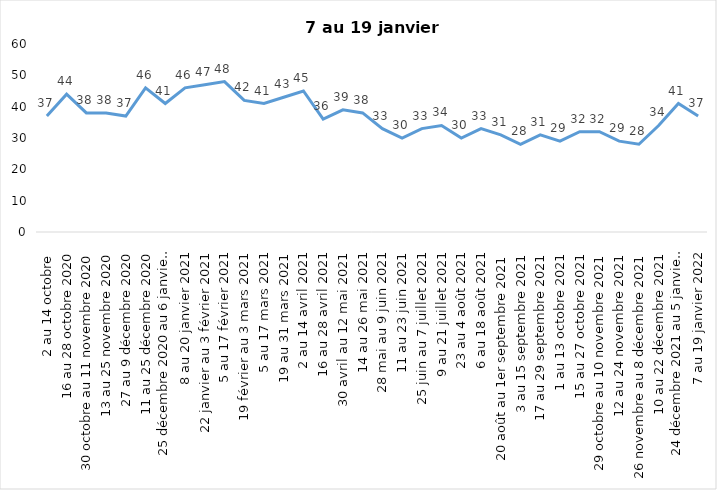
| Category | Toujours aux trois mesures |
|---|---|
| 2 au 14 octobre  | 37 |
| 16 au 28 octobre 2020 | 44 |
| 30 octobre au 11 novembre 2020 | 38 |
| 13 au 25 novembre 2020 | 38 |
| 27 au 9 décembre 2020 | 37 |
| 11 au 25 décembre 2020 | 46 |
| 25 décembre 2020 au 6 janvier 2021 | 41 |
| 8 au 20 janvier 2021 | 46 |
| 22 janvier au 3 février 2021 | 47 |
| 5 au 17 février 2021 | 48 |
| 19 février au 3 mars 2021 | 42 |
| 5 au 17 mars 2021 | 41 |
| 19 au 31 mars 2021 | 43 |
| 2 au 14 avril 2021 | 45 |
| 16 au 28 avril 2021 | 36 |
| 30 avril au 12 mai 2021 | 39 |
| 14 au 26 mai 2021 | 38 |
| 28 mai au 9 juin 2021 | 33 |
| 11 au 23 juin 2021 | 30 |
| 25 juin au 7 juillet 2021 | 33 |
| 9 au 21 juillet 2021 | 34 |
| 23 au 4 août 2021 | 30 |
| 6 au 18 août 2021 | 33 |
| 20 août au 1er septembre 2021 | 31 |
| 3 au 15 septembre 2021 | 28 |
| 17 au 29 septembre 2021 | 31 |
| 1 au 13 octobre 2021 | 29 |
| 15 au 27 octobre 2021 | 32 |
| 29 octobre au 10 novembre 2021 | 32 |
| 12 au 24 novembre 2021 | 29 |
| 26 novembre au 8 décembre 2021 | 28 |
| 10 au 22 décembre 2021 | 34 |
| 24 décembre 2021 au 5 janvier 2022 | 41 |
| 7 au 19 janvier 2022 | 37 |